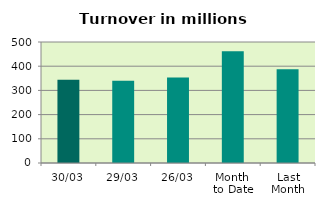
| Category | Series 0 |
|---|---|
| 30/03 | 343.518 |
| 29/03 | 340.057 |
| 26/03 | 352.985 |
| Month 
to Date | 461.774 |
| Last
Month | 387.65 |